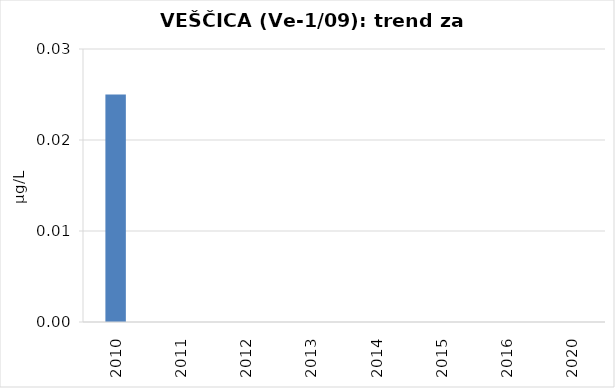
| Category | Vsota |
|---|---|
| 2010 | 0.025 |
| 2011 | 0 |
| 2012 | 0 |
| 2013 | 0 |
| 2014 | 0 |
| 2015 | 0 |
| 2016 | 0 |
| 2020 | 0 |